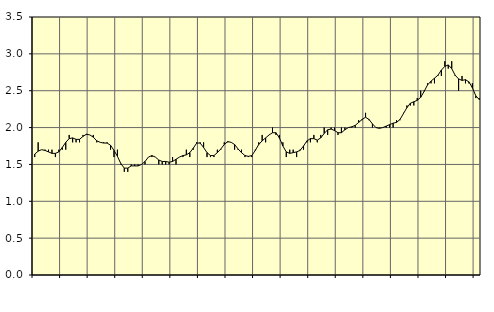
| Category | Piggar | Series 1 |
|---|---|---|
| nan | 1.6 | 1.64 |
| 87.0 | 1.8 | 1.68 |
| 87.0 | 1.7 | 1.7 |
| 87.0 | 1.7 | 1.69 |
| nan | 1.7 | 1.67 |
| 88.0 | 1.7 | 1.65 |
| 88.0 | 1.6 | 1.65 |
| 88.0 | 1.7 | 1.67 |
| nan | 1.7 | 1.73 |
| 89.0 | 1.7 | 1.8 |
| 89.0 | 1.9 | 1.85 |
| 89.0 | 1.8 | 1.86 |
| nan | 1.8 | 1.84 |
| 90.0 | 1.8 | 1.84 |
| 90.0 | 1.9 | 1.88 |
| 90.0 | 1.9 | 1.91 |
| nan | 1.9 | 1.9 |
| 91.0 | 1.9 | 1.87 |
| 91.0 | 1.8 | 1.82 |
| 91.0 | 1.8 | 1.8 |
| nan | 1.8 | 1.79 |
| 92.0 | 1.8 | 1.79 |
| 92.0 | 1.7 | 1.76 |
| 92.0 | 1.6 | 1.69 |
| nan | 1.7 | 1.61 |
| 93.0 | 1.5 | 1.51 |
| 93.0 | 1.4 | 1.45 |
| 93.0 | 1.4 | 1.45 |
| nan | 1.5 | 1.48 |
| 94.0 | 1.5 | 1.48 |
| 94.0 | 1.5 | 1.48 |
| 94.0 | 1.5 | 1.5 |
| nan | 1.5 | 1.54 |
| 95.0 | 1.6 | 1.6 |
| 95.0 | 1.6 | 1.62 |
| 95.0 | 1.6 | 1.6 |
| nan | 1.5 | 1.56 |
| 96.0 | 1.5 | 1.54 |
| 96.0 | 1.5 | 1.54 |
| 96.0 | 1.5 | 1.53 |
| nan | 1.6 | 1.54 |
| 97.0 | 1.5 | 1.57 |
| 97.0 | 1.6 | 1.6 |
| 97.0 | 1.6 | 1.62 |
| nan | 1.7 | 1.63 |
| 98.0 | 1.6 | 1.66 |
| 98.0 | 1.7 | 1.72 |
| 98.0 | 1.8 | 1.79 |
| nan | 1.8 | 1.79 |
| 99.0 | 1.8 | 1.73 |
| 99.0 | 1.6 | 1.66 |
| 99.0 | 1.6 | 1.62 |
| nan | 1.6 | 1.62 |
| 0.0 | 1.7 | 1.66 |
| 0.0 | 1.7 | 1.71 |
| 0.0 | 1.8 | 1.77 |
| nan | 1.8 | 1.81 |
| 1.0 | 1.8 | 1.8 |
| 1.0 | 1.7 | 1.77 |
| 1.0 | 1.7 | 1.71 |
| nan | 1.7 | 1.66 |
| 2.0 | 1.6 | 1.62 |
| 2.0 | 1.6 | 1.61 |
| 2.0 | 1.6 | 1.62 |
| nan | 1.7 | 1.69 |
| 3.0 | 1.8 | 1.77 |
| 3.0 | 1.9 | 1.82 |
| 3.0 | 1.8 | 1.86 |
| nan | 1.9 | 1.9 |
| 4.0 | 2 | 1.93 |
| 4.0 | 1.9 | 1.93 |
| 4.0 | 1.9 | 1.86 |
| nan | 1.8 | 1.75 |
| 5.0 | 1.6 | 1.67 |
| 5.0 | 1.7 | 1.65 |
| 5.0 | 1.7 | 1.66 |
| nan | 1.6 | 1.67 |
| 6.0 | 1.7 | 1.69 |
| 6.0 | 1.7 | 1.75 |
| 6.0 | 1.8 | 1.82 |
| nan | 1.8 | 1.85 |
| 7.0 | 1.9 | 1.85 |
| 7.0 | 1.8 | 1.83 |
| 7.0 | 1.9 | 1.86 |
| nan | 2 | 1.92 |
| 8.0 | 1.9 | 1.97 |
| 8.0 | 2 | 1.98 |
| 8.0 | 2 | 1.96 |
| nan | 1.9 | 1.93 |
| 9.0 | 2 | 1.93 |
| 9.0 | 2 | 1.97 |
| 9.0 | 2 | 2 |
| nan | 2 | 2.01 |
| 10.0 | 2 | 2.03 |
| 10.0 | 2.1 | 2.07 |
| 10.0 | 2.1 | 2.11 |
| nan | 2.2 | 2.14 |
| 11.0 | 2.1 | 2.11 |
| 11.0 | 2 | 2.05 |
| 11.0 | 2 | 2 |
| nan | 2 | 1.99 |
| 12.0 | 2 | 2 |
| 12.0 | 2 | 2.02 |
| 12.0 | 2 | 2.04 |
| nan | 2 | 2.06 |
| 13.0 | 2.1 | 2.07 |
| 13.0 | 2.1 | 2.11 |
| 13.0 | 2.2 | 2.19 |
| nan | 2.3 | 2.27 |
| 14.0 | 2.3 | 2.33 |
| 14.0 | 2.3 | 2.35 |
| 14.0 | 2.4 | 2.37 |
| nan | 2.5 | 2.41 |
| 15.0 | 2.5 | 2.49 |
| 15.0 | 2.6 | 2.58 |
| 15.0 | 2.6 | 2.63 |
| nan | 2.6 | 2.67 |
| 16.0 | 2.7 | 2.71 |
| 16.0 | 2.7 | 2.78 |
| 16.0 | 2.9 | 2.83 |
| nan | 2.8 | 2.85 |
| 17.0 | 2.9 | 2.8 |
| 17.0 | 2.7 | 2.71 |
| 17.0 | 2.5 | 2.66 |
| nan | 2.7 | 2.64 |
| 18.0 | 2.6 | 2.65 |
| 18.0 | 2.6 | 2.62 |
| 18.0 | 2.6 | 2.54 |
| nan | 2.4 | 2.43 |
| 19.0 | 2.4 | 2.38 |